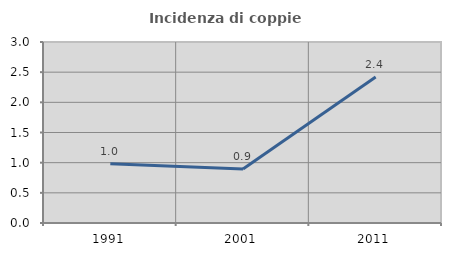
| Category | Incidenza di coppie miste |
|---|---|
| 1991.0 | 0.982 |
| 2001.0 | 0.895 |
| 2011.0 | 2.422 |